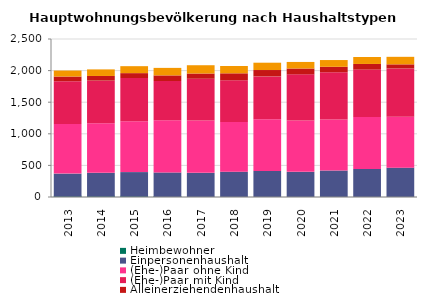
| Category | Heimbewohner | Einpersonenhaushalt | (Ehe-)Paar ohne Kind | (Ehe-)Paar mit Kind | Alleinerziehendenhaushalt | sonstiger Mehrpersonenhaushalt |
|---|---|---|---|---|---|---|
| 2013.0 | 20 | 350 | 785 | 677 | 74 | 95 |
| 2014.0 | 20 | 362 | 785 | 674 | 74 | 104 |
| 2015.0 | 20 | 374 | 806 | 683 | 77 | 110 |
| 2016.0 | 14 | 374 | 827 | 620 | 89 | 119 |
| 2017.0 | 2 | 380 | 830 | 659 | 83 | 131 |
| 2018.0 | 2 | 398 | 788 | 659 | 110 | 116 |
| 2019.0 | 0 | 413 | 818 | 677 | 101 | 116 |
| 2020.0 | 0 | 398 | 812 | 731 | 92 | 104 |
| 2021.0 | 0 | 419 | 809 | 746 | 86 | 107 |
| 2022.0 | 0 | 443 | 824 | 749 | 89 | 110 |
| 2023.0 | 0 | 464 | 806 | 764 | 65 | 119 |